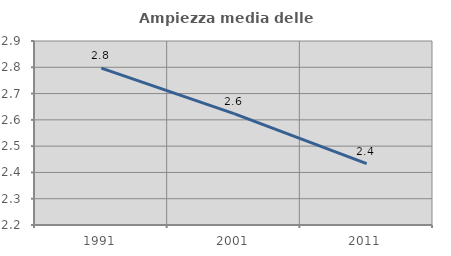
| Category | Ampiezza media delle famiglie |
|---|---|
| 1991.0 | 2.797 |
| 2001.0 | 2.624 |
| 2011.0 | 2.433 |